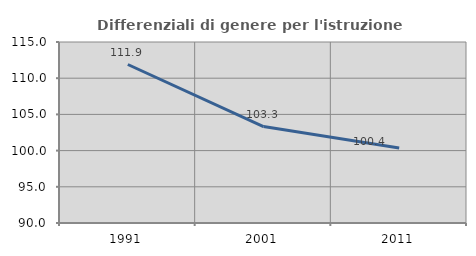
| Category | Differenziali di genere per l'istruzione superiore |
|---|---|
| 1991.0 | 111.891 |
| 2001.0 | 103.319 |
| 2011.0 | 100.354 |